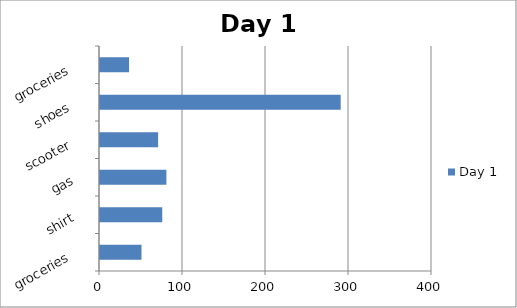
| Category | Day 1 |
|---|---|
| groceries | 50 |
| shirt | 75 |
| gas | 80 |
| scooter | 70 |
| shoes | 290 |
| groceries | 35 |